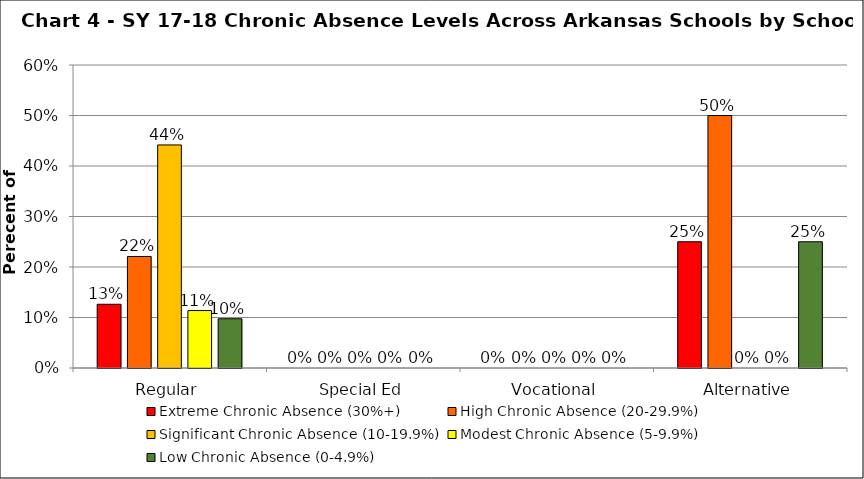
| Category | Extreme Chronic Absence (30%+) | High Chronic Absence (20-29.9%) | Significant Chronic Absence (10-19.9%) | Modest Chronic Absence (5-9.9%) | Low Chronic Absence (0-4.9%) |
|---|---|---|---|---|---|
| 0 | 0.126 | 0.221 | 0.442 | 0.114 | 0.098 |
| 1 | 0 | 0 | 0 | 0 | 0 |
| 2 | 0 | 0 | 0 | 0 | 0 |
| 3 | 0.25 | 0.5 | 0 | 0 | 0.25 |